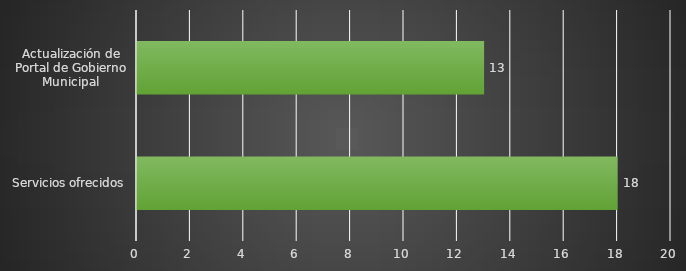
| Category | INDICADOR  |
|---|---|
| Servicios ofrecidos | 18 |
| Actualización de Portal de Gobierno Municipal | 13 |